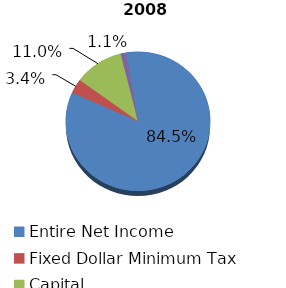
| Category | Series 0 |
|---|---|
| Entire Net Income | 1763886919 |
| Fixed Dollar Minimum Tax | 70270625 |
| Capital | 229939178 |
| Alternative Minimum Taxable Income | 23008662 |